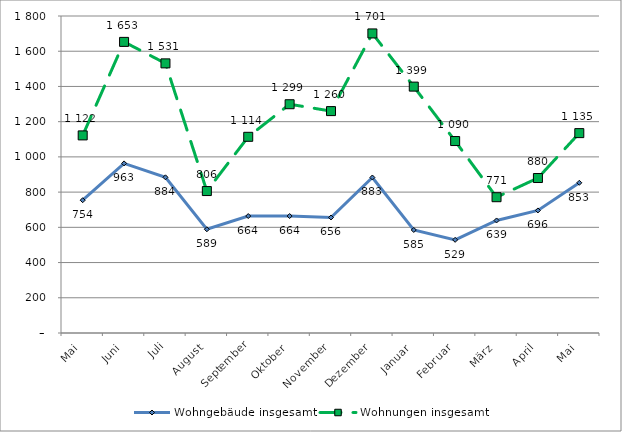
| Category | Wohngebäude insgesamt | Wohnungen insgesamt |
|---|---|---|
| Mai | 754 | 1122 |
| Juni | 963 | 1653 |
| Juli | 884 | 1531 |
| August | 589 | 806 |
| September | 664 | 1114 |
| Oktober | 664 | 1299 |
| November | 656 | 1260 |
| Dezember | 883 | 1701 |
| Januar | 585 | 1399 |
| Februar | 529 | 1090 |
| März | 639 | 771 |
| April | 696 | 880 |
| Mai | 853 | 1135 |